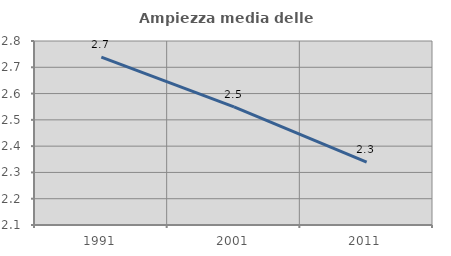
| Category | Ampiezza media delle famiglie |
|---|---|
| 1991.0 | 2.738 |
| 2001.0 | 2.549 |
| 2011.0 | 2.339 |